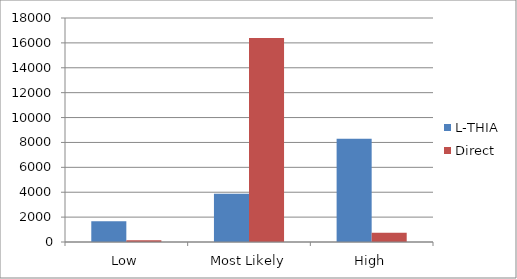
| Category | L-THIA | Direct |
|---|---|---|
| Low | 1669 | 139.2 |
| Most Likely | 3882.4 | 16383.7 |
| High | 8304.2 | 745.9 |